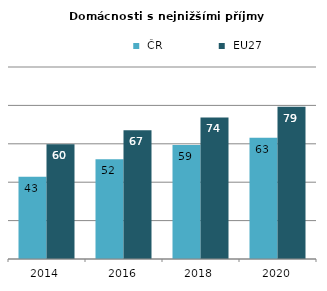
| Category |  ČR |  EU27 |
|---|---|---|
| 2014.0 | 42.809 | 59.734 |
| 2016.0 | 51.925 | 67.058 |
| 2018.0 | 59.333 | 73.739 |
| 2020.0 | 63.2 | 79.242 |